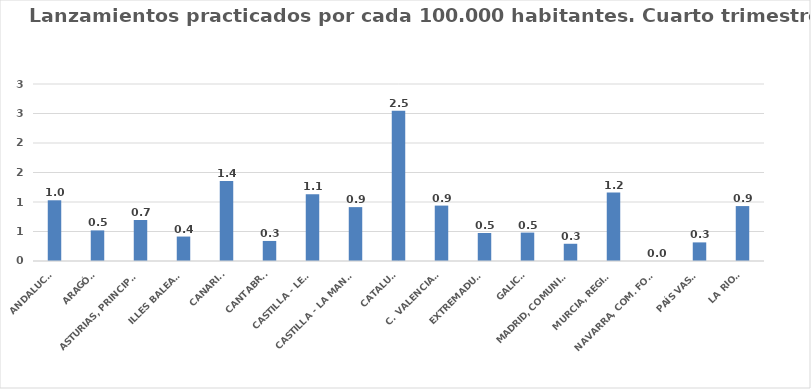
| Category | Series 0 |
|---|---|
| ANDALUCÍA | 1.029 |
| ARAGÓN | 0.519 |
| ASTURIAS, PRINCIPADO | 0.695 |
| ILLES BALEARS | 0.414 |
| CANARIAS | 1.356 |
| CANTABRIA | 0.34 |
| CASTILLA - LEÓN | 1.133 |
| CASTILLA - LA MANCHA | 0.913 |
| CATALUÑA | 2.545 |
| C. VALENCIANA | 0.939 |
| EXTREMADURA | 0.474 |
| GALICIA | 0.482 |
| MADRID, COMUNIDAD | 0.292 |
| MURCIA, REGIÓN | 1.159 |
| NAVARRA, COM. FORAL | 0 |
| PAÍS VASCO | 0.315 |
| LA RIOJA | 0.931 |